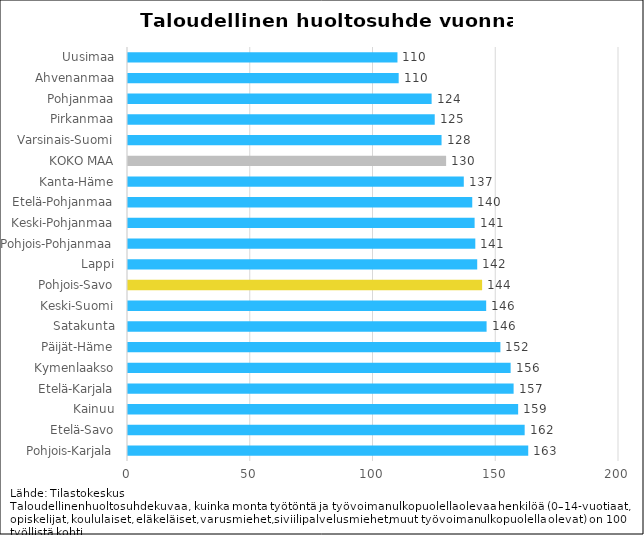
| Category | Series 0 |
|---|---|
| Pohjois-Karjala | 163.027 |
| Etelä-Savo | 161.577 |
| Kainuu | 158.916 |
| Etelä-Karjala | 157.071 |
| Kymenlaakso | 155.856 |
| Päijät-Häme | 151.686 |
| Satakunta | 146.062 |
| Keski-Suomi | 145.9 |
| Pohjois-Savo | 144.243 |
| Lappi | 142.245 |
| Pohjois-Pohjanmaa | 141.469 |
| Keski-Pohjanmaa | 141.187 |
| Etelä-Pohjanmaa | 140.224 |
| Kanta-Häme | 136.78 |
| KOKO MAA | 129.58 |
| Varsinais-Suomi | 127.72 |
| Pirkanmaa | 124.943 |
| Pohjanmaa | 123.675 |
| Ahvenanmaa | 110.257 |
| Uusimaa | 109.761 |